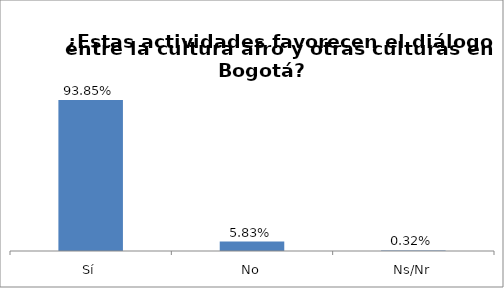
| Category | Total |
|---|---|
| Sí | 0.939 |
| No | 0.058 |
| Ns/Nr | 0.003 |